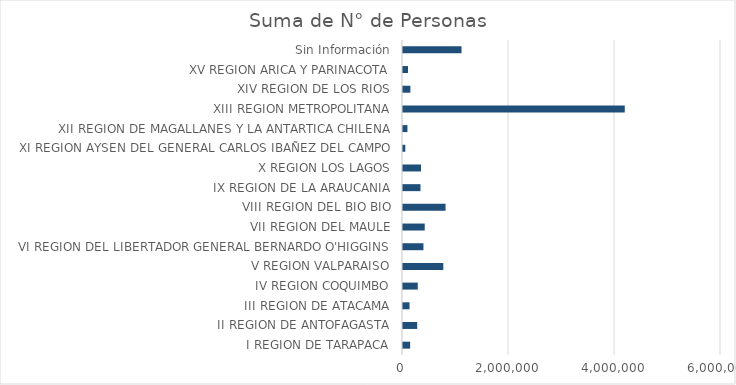
| Category | Series 0 |
|---|---|
|    I REGION DE TARAPACA | 134732 |
|   II REGION DE ANTOFAGASTA | 267583 |
|  III REGION DE ATACAMA | 123221 |
|   IV REGION COQUIMBO | 278511 |
|    V REGION VALPARAISO | 760498 |
|   VI REGION DEL LIBERTADOR GENERAL BERNARDO O'HIGGINS | 385640 |
|  VII REGION DEL MAULE | 410055 |
| VIII REGION DEL BIO BIO | 802713 |
|   IX REGION DE LA ARAUCANIA | 329772 |
|    X REGION LOS LAGOS | 340239 |
|   XI REGION AYSEN DEL GENERAL CARLOS IBAÑEZ DEL CAMPO | 43460 |
|  XII REGION DE MAGALLANES Y LA ANTARTICA CHILENA | 83605 |
| XIII REGION METROPOLITANA | 4184400 |
|  XIV REGION DE LOS RIOS | 139459 |
|   XV REGION ARICA Y PARINACOTA | 94437 |
| Sin Información | 1104081 |